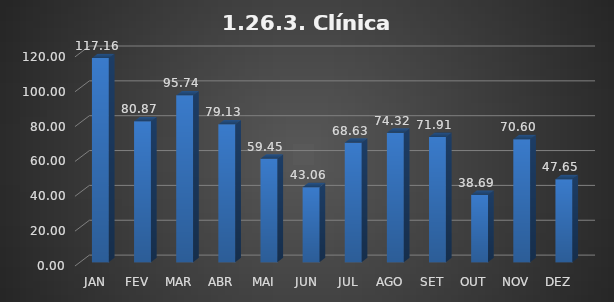
| Category | 1.26.3. Clínica Cirúrgica |
|---|---|
|  JAN  | 117.158 |
|  FEV  | 80.874 |
|  MAR  | 95.738 |
|  ABR  | 79.126 |
|  MAI  | 59.454 |
|  JUN  | 43.06 |
|  JUL  | 68.634 |
|  AGO  | 74.317 |
|  SET  | 71.913 |
|  OUT  | 38.689 |
|  NOV  | 70.601 |
|  DEZ  | 47.65 |